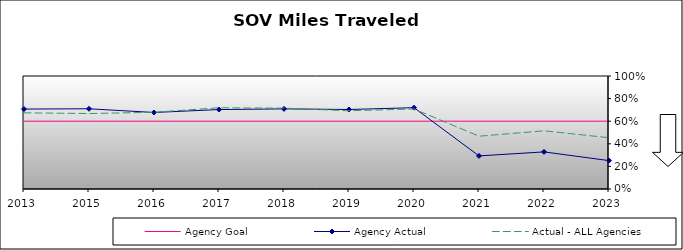
| Category | Agency Goal | Agency Actual | Actual - ALL Agencies |
|---|---|---|---|
| 2013.0 | 0.6 | 0.707 | 0.674 |
| 2015.0 | 0.6 | 0.71 | 0.668 |
| 2016.0 | 0.6 | 0.677 | 0.679 |
| 2017.0 | 0.6 | 0.703 | 0.719 |
| 2018.0 | 0.6 | 0.709 | 0.715 |
| 2019.0 | 0.6 | 0.704 | 0.692 |
| 2020.0 | 0.6 | 0.72 | 0.708 |
| 2021.0 | 0.6 | 0.293 | 0.467 |
| 2022.0 | 0.6 | 0.328 | 0.515 |
| 2023.0 | 0.6 | 0.251 | 0.454 |